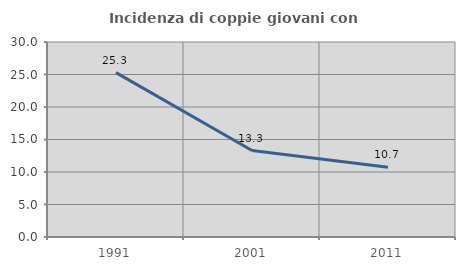
| Category | Incidenza di coppie giovani con figli |
|---|---|
| 1991.0 | 25.287 |
| 2001.0 | 13.3 |
| 2011.0 | 10.748 |